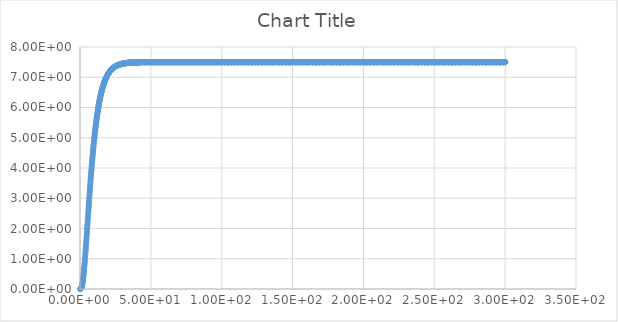
| Category | Series 0 |
|---|---|
| 0.1 | 0 |
| 0.2 | 0.001 |
| 0.3 | 0.002 |
| 0.4 | 0.004 |
| 0.5 | 0.007 |
| 0.6 | 0.011 |
| 0.7 | 0.018 |
| 0.8 | 0.025 |
| 0.9 | 0.035 |
| 1.0 | 0.046 |
| 1.1 | 0.06 |
| 1.2 | 0.076 |
| 1.3 | 0.094 |
| 1.4 | 0.114 |
| 1.5 | 0.136 |
| 1.6 | 0.16 |
| 1.7 | 0.187 |
| 1.8 | 0.215 |
| 1.9 | 0.246 |
| 2.0 | 0.279 |
| 2.1 | 0.314 |
| 2.2 | 0.352 |
| 2.3 | 0.391 |
| 2.4 | 0.432 |
| 2.5 | 0.475 |
| 2.6 | 0.519 |
| 2.7 | 0.566 |
| 2.8 | 0.614 |
| 2.9 | 0.664 |
| 3.0 | 0.715 |
| 3.1 | 0.768 |
| 3.2 | 0.822 |
| 3.3 | 0.877 |
| 3.4 | 0.934 |
| 3.5 | 0.992 |
| 3.6 | 1.05 |
| 3.7 | 1.11 |
| 3.8 | 1.17 |
| 3.9 | 1.23 |
| 4.0 | 1.3 |
| 4.1 | 1.36 |
| 4.2 | 1.42 |
| 4.3 | 1.49 |
| 4.4 | 1.55 |
| 4.5 | 1.62 |
| 4.6 | 1.69 |
| 4.7 | 1.75 |
| 4.8 | 1.82 |
| 4.9 | 1.89 |
| 5.0 | 1.96 |
| 5.1 | 2.02 |
| 5.2 | 2.09 |
| 5.3 | 2.16 |
| 5.4 | 2.23 |
| 5.5 | 2.3 |
| 5.6 | 2.36 |
| 5.7 | 2.43 |
| 5.8 | 2.5 |
| 5.9 | 2.57 |
| 6.0 | 2.64 |
| 6.1 | 2.7 |
| 6.2 | 2.77 |
| 6.3 | 2.84 |
| 6.4 | 2.9 |
| 6.5 | 2.97 |
| 6.6 | 3.04 |
| 6.7 | 3.1 |
| 6.8 | 3.17 |
| 6.9 | 3.23 |
| 7.0 | 3.29 |
| 7.1 | 3.36 |
| 7.2 | 3.42 |
| 7.3 | 3.48 |
| 7.4 | 3.54 |
| 7.5 | 3.61 |
| 7.6 | 3.67 |
| 7.7 | 3.73 |
| 7.8 | 3.79 |
| 7.9 | 3.85 |
| 8.0 | 3.9 |
| 8.1 | 3.96 |
| 8.2 | 4.02 |
| 8.3 | 4.08 |
| 8.4 | 4.13 |
| 8.5 | 4.19 |
| 8.6 | 4.24 |
| 8.7 | 4.3 |
| 8.8 | 4.35 |
| 8.9 | 4.4 |
| 9.0 | 4.45 |
| 9.1 | 4.51 |
| 9.2 | 4.56 |
| 9.3 | 4.61 |
| 9.4 | 4.66 |
| 9.5 | 4.7 |
| 9.6 | 4.75 |
| 9.7 | 4.8 |
| 9.8 | 4.85 |
| 9.9 | 4.89 |
| 10.0 | 4.94 |
| 10.1 | 4.98 |
| 10.2 | 5.03 |
| 10.3 | 5.07 |
| 10.4 | 5.11 |
| 10.5 | 5.16 |
| 10.6 | 5.2 |
| 10.7 | 5.24 |
| 10.8 | 5.28 |
| 10.9 | 5.32 |
| 11.0 | 5.36 |
| 11.1 | 5.4 |
| 11.2 | 5.44 |
| 11.3 | 5.47 |
| 11.4 | 5.51 |
| 11.5 | 5.55 |
| 11.6 | 5.58 |
| 11.7 | 5.62 |
| 11.8 | 5.65 |
| 11.9 | 5.68 |
| 12.0 | 5.72 |
| 12.1 | 5.75 |
| 12.2 | 5.78 |
| 12.3 | 5.81 |
| 12.4 | 5.85 |
| 12.5 | 5.88 |
| 12.6 | 5.91 |
| 12.7 | 5.94 |
| 12.8 | 5.96 |
| 12.9 | 5.99 |
| 13.0 | 6.02 |
| 13.1 | 6.05 |
| 13.2 | 6.08 |
| 13.3 | 6.1 |
| 13.4 | 6.13 |
| 13.5 | 6.16 |
| 13.6 | 6.18 |
| 13.7 | 6.21 |
| 13.8 | 6.23 |
| 13.9 | 6.25 |
| 14.0 | 6.28 |
| 14.1 | 6.3 |
| 14.2 | 6.32 |
| 14.3 | 6.35 |
| 14.4 | 6.37 |
| 14.5 | 6.39 |
| 14.6 | 6.41 |
| 14.7 | 6.43 |
| 14.8 | 6.45 |
| 14.9 | 6.47 |
| 15.0 | 6.49 |
| 15.1 | 6.51 |
| 15.2 | 6.53 |
| 15.3 | 6.55 |
| 15.4 | 6.57 |
| 15.5 | 6.58 |
| 15.6 | 6.6 |
| 15.7 | 6.62 |
| 15.8 | 6.64 |
| 15.9 | 6.65 |
| 16.0 | 6.67 |
| 16.1 | 6.68 |
| 16.2 | 6.7 |
| 16.3 | 6.72 |
| 16.4 | 6.73 |
| 16.5 | 6.75 |
| 16.6 | 6.76 |
| 16.7 | 6.77 |
| 16.8 | 6.79 |
| 16.9 | 6.8 |
| 17.0 | 6.82 |
| 17.1 | 6.83 |
| 17.2 | 6.84 |
| 17.3 | 6.86 |
| 17.4 | 6.87 |
| 17.5 | 6.88 |
| 17.6 | 6.89 |
| 17.7 | 6.9 |
| 17.8 | 6.92 |
| 17.9 | 6.93 |
| 18.0 | 6.94 |
| 18.1 | 6.95 |
| 18.2 | 6.96 |
| 18.3 | 6.97 |
| 18.4 | 6.98 |
| 18.5 | 6.99 |
| 18.6 | 7 |
| 18.7 | 7.01 |
| 18.8 | 7.02 |
| 18.9 | 7.03 |
| 19.0 | 7.04 |
| 19.1 | 7.05 |
| 19.2 | 7.06 |
| 19.3 | 7.07 |
| 19.4 | 7.07 |
| 19.5 | 7.08 |
| 19.6 | 7.09 |
| 19.7 | 7.1 |
| 19.8 | 7.11 |
| 19.9 | 7.11 |
| 20.0 | 7.12 |
| 20.1 | 7.13 |
| 20.2 | 7.14 |
| 20.3 | 7.14 |
| 20.4 | 7.15 |
| 20.5 | 7.16 |
| 20.6 | 7.16 |
| 20.7 | 7.17 |
| 20.8 | 7.18 |
| 20.9 | 7.18 |
| 21.0 | 7.19 |
| 21.1 | 7.2 |
| 21.2 | 7.2 |
| 21.3 | 7.21 |
| 21.4 | 7.21 |
| 21.5 | 7.22 |
| 21.6 | 7.22 |
| 21.7 | 7.23 |
| 21.8 | 7.24 |
| 21.9 | 7.24 |
| 22.0 | 7.25 |
| 22.1 | 7.25 |
| 22.2 | 7.26 |
| 22.3 | 7.26 |
| 22.4 | 7.26 |
| 22.5 | 7.27 |
| 22.6 | 7.27 |
| 22.7 | 7.28 |
| 22.8 | 7.28 |
| 22.9 | 7.29 |
| 23.0 | 7.29 |
| 23.1 | 7.3 |
| 23.2 | 7.3 |
| 23.3 | 7.3 |
| 23.4 | 7.31 |
| 23.5 | 7.31 |
| 23.6 | 7.31 |
| 23.7 | 7.32 |
| 23.8 | 7.32 |
| 23.9 | 7.33 |
| 24.0 | 7.33 |
| 24.1 | 7.33 |
| 24.2 | 7.34 |
| 24.3 | 7.34 |
| 24.4 | 7.34 |
| 24.5 | 7.35 |
| 24.6 | 7.35 |
| 24.7 | 7.35 |
| 24.8 | 7.35 |
| 24.9 | 7.36 |
| 25.0 | 7.36 |
| 25.1 | 7.36 |
| 25.2 | 7.37 |
| 25.3 | 7.37 |
| 25.4 | 7.37 |
| 25.5 | 7.37 |
| 25.6 | 7.38 |
| 25.7 | 7.38 |
| 25.8 | 7.38 |
| 25.9 | 7.38 |
| 26.0 | 7.39 |
| 26.1 | 7.39 |
| 26.2 | 7.39 |
| 26.3 | 7.39 |
| 26.4 | 7.39 |
| 26.5 | 7.4 |
| 26.6 | 7.4 |
| 26.7 | 7.4 |
| 26.8 | 7.4 |
| 26.9 | 7.4 |
| 27.0 | 7.41 |
| 27.1 | 7.41 |
| 27.2 | 7.41 |
| 27.3 | 7.41 |
| 27.4 | 7.41 |
| 27.5 | 7.41 |
| 27.6 | 7.42 |
| 27.7 | 7.42 |
| 27.8 | 7.42 |
| 27.9 | 7.42 |
| 28.0 | 7.42 |
| 28.1 | 7.42 |
| 28.2 | 7.43 |
| 28.3 | 7.43 |
| 28.4 | 7.43 |
| 28.5 | 7.43 |
| 28.6 | 7.43 |
| 28.7 | 7.43 |
| 28.8 | 7.43 |
| 28.9 | 7.44 |
| 29.0 | 7.44 |
| 29.1 | 7.44 |
| 29.2 | 7.44 |
| 29.3 | 7.44 |
| 29.4 | 7.44 |
| 29.5 | 7.44 |
| 29.6 | 7.44 |
| 29.7 | 7.45 |
| 29.8 | 7.45 |
| 29.9 | 7.45 |
| 30.0 | 7.45 |
| 30.1 | 7.45 |
| 30.2 | 7.45 |
| 30.3 | 7.45 |
| 30.4 | 7.45 |
| 30.5 | 7.45 |
| 30.6 | 7.45 |
| 30.7 | 7.46 |
| 30.8 | 7.46 |
| 30.9 | 7.46 |
| 31.0 | 7.46 |
| 31.1 | 7.46 |
| 31.2 | 7.46 |
| 31.3 | 7.46 |
| 31.4 | 7.46 |
| 31.5 | 7.46 |
| 31.6 | 7.46 |
| 31.7 | 7.46 |
| 31.8 | 7.46 |
| 31.9 | 7.46 |
| 32.0 | 7.47 |
| 32.1 | 7.47 |
| 32.2 | 7.47 |
| 32.3 | 7.47 |
| 32.4 | 7.47 |
| 32.5 | 7.47 |
| 32.6 | 7.47 |
| 32.7 | 7.47 |
| 32.8 | 7.47 |
| 32.9 | 7.47 |
| 33.0 | 7.47 |
| 33.1 | 7.47 |
| 33.2 | 7.47 |
| 33.3 | 7.47 |
| 33.4 | 7.47 |
| 33.5 | 7.47 |
| 33.6 | 7.47 |
| 33.7 | 7.48 |
| 33.8 | 7.48 |
| 33.9 | 7.48 |
| 34.0 | 7.48 |
| 34.1 | 7.48 |
| 34.2 | 7.48 |
| 34.3 | 7.48 |
| 34.4 | 7.48 |
| 34.5 | 7.48 |
| 34.6 | 7.48 |
| 34.7 | 7.48 |
| 34.8 | 7.48 |
| 34.9 | 7.48 |
| 35.0 | 7.48 |
| 35.1 | 7.48 |
| 35.2 | 7.48 |
| 35.3 | 7.48 |
| 35.4 | 7.48 |
| 35.5 | 7.48 |
| 35.6 | 7.48 |
| 35.7 | 7.48 |
| 35.8 | 7.48 |
| 35.9 | 7.48 |
| 36.0 | 7.48 |
| 36.1 | 7.48 |
| 36.2 | 7.48 |
| 36.3 | 7.49 |
| 36.4 | 7.49 |
| 36.5 | 7.49 |
| 36.6 | 7.49 |
| 36.7 | 7.49 |
| 36.8 | 7.49 |
| 36.9 | 7.49 |
| 37.0 | 7.49 |
| 37.1 | 7.49 |
| 37.2 | 7.49 |
| 37.3 | 7.49 |
| 37.4 | 7.49 |
| 37.5 | 7.49 |
| 37.6 | 7.49 |
| 37.7 | 7.49 |
| 37.8 | 7.49 |
| 37.9 | 7.49 |
| 38.0 | 7.49 |
| 38.1 | 7.49 |
| 38.2 | 7.49 |
| 38.3 | 7.49 |
| 38.4 | 7.49 |
| 38.5 | 7.49 |
| 38.6 | 7.49 |
| 38.7 | 7.49 |
| 38.8 | 7.49 |
| 38.9 | 7.49 |
| 39.0 | 7.49 |
| 39.1 | 7.49 |
| 39.2 | 7.49 |
| 39.3 | 7.49 |
| 39.4 | 7.49 |
| 39.5 | 7.49 |
| 39.6 | 7.49 |
| 39.7 | 7.49 |
| 39.8 | 7.49 |
| 39.9 | 7.49 |
| 40.0 | 7.49 |
| 40.1 | 7.49 |
| 40.2 | 7.49 |
| 40.3 | 7.49 |
| 40.4 | 7.49 |
| 40.5 | 7.49 |
| 40.6 | 7.49 |
| 40.7 | 7.49 |
| 40.8 | 7.49 |
| 40.9 | 7.49 |
| 41.0 | 7.49 |
| 41.1 | 7.49 |
| 41.2 | 7.49 |
| 41.3 | 7.49 |
| 41.4 | 7.49 |
| 41.5 | 7.49 |
| 41.6 | 7.49 |
| 41.7 | 7.49 |
| 41.8 | 7.5 |
| 41.9 | 7.5 |
| 42.0 | 7.5 |
| 42.1 | 7.5 |
| 42.2 | 7.5 |
| 42.3 | 7.5 |
| 42.4 | 7.5 |
| 42.5 | 7.5 |
| 42.6 | 7.5 |
| 42.7 | 7.5 |
| 42.8 | 7.5 |
| 42.9 | 7.5 |
| 43.0 | 7.5 |
| 43.1 | 7.5 |
| 43.2 | 7.5 |
| 43.3 | 7.5 |
| 43.4 | 7.5 |
| 43.5 | 7.5 |
| 43.6 | 7.5 |
| 43.7 | 7.5 |
| 43.8 | 7.5 |
| 43.9 | 7.5 |
| 44.0 | 7.5 |
| 44.1 | 7.5 |
| 44.2 | 7.5 |
| 44.3 | 7.5 |
| 44.4 | 7.5 |
| 44.5 | 7.5 |
| 44.6 | 7.5 |
| 44.7 | 7.5 |
| 44.8 | 7.5 |
| 44.9 | 7.5 |
| 45.0 | 7.5 |
| 45.1 | 7.5 |
| 45.2 | 7.5 |
| 45.3 | 7.5 |
| 45.4 | 7.5 |
| 45.5 | 7.5 |
| 45.6 | 7.5 |
| 45.7 | 7.5 |
| 45.8 | 7.5 |
| 45.9 | 7.5 |
| 46.0 | 7.5 |
| 46.1 | 7.5 |
| 46.2 | 7.5 |
| 46.3 | 7.5 |
| 46.4 | 7.5 |
| 46.5 | 7.5 |
| 46.6 | 7.5 |
| 46.7 | 7.5 |
| 46.8 | 7.5 |
| 46.9 | 7.5 |
| 47.0 | 7.5 |
| 47.1 | 7.5 |
| 47.2 | 7.5 |
| 47.3 | 7.5 |
| 47.4 | 7.5 |
| 47.5 | 7.5 |
| 47.6 | 7.5 |
| 47.7 | 7.5 |
| 47.8 | 7.5 |
| 47.9 | 7.5 |
| 48.0 | 7.5 |
| 48.1 | 7.5 |
| 48.2 | 7.5 |
| 48.3 | 7.5 |
| 48.4 | 7.5 |
| 48.5 | 7.5 |
| 48.6 | 7.5 |
| 48.7 | 7.5 |
| 48.8 | 7.5 |
| 48.9 | 7.5 |
| 49.0 | 7.5 |
| 49.1 | 7.5 |
| 49.2 | 7.5 |
| 49.3 | 7.5 |
| 49.4 | 7.5 |
| 49.5 | 7.5 |
| 49.6 | 7.5 |
| 49.7 | 7.5 |
| 49.8 | 7.5 |
| 49.9 | 7.5 |
| 50.0 | 7.5 |
| 50.1 | 7.5 |
| 50.2 | 7.5 |
| 50.3 | 7.5 |
| 50.4 | 7.5 |
| 50.5 | 7.5 |
| 50.6 | 7.5 |
| 50.7 | 7.5 |
| 50.8 | 7.5 |
| 50.9 | 7.5 |
| 51.0 | 7.5 |
| 51.1 | 7.5 |
| 51.2 | 7.5 |
| 51.3 | 7.5 |
| 51.4 | 7.5 |
| 51.5 | 7.5 |
| 51.6 | 7.5 |
| 51.7 | 7.5 |
| 51.8 | 7.5 |
| 51.9 | 7.5 |
| 52.0 | 7.5 |
| 52.1 | 7.5 |
| 52.2 | 7.5 |
| 52.3 | 7.5 |
| 52.4 | 7.5 |
| 52.5 | 7.5 |
| 52.6 | 7.5 |
| 52.7 | 7.5 |
| 52.8 | 7.5 |
| 52.9 | 7.5 |
| 53.0 | 7.5 |
| 53.1 | 7.5 |
| 53.2 | 7.5 |
| 53.3 | 7.5 |
| 53.4 | 7.5 |
| 53.5 | 7.5 |
| 53.6 | 7.5 |
| 53.7 | 7.5 |
| 53.8 | 7.5 |
| 53.9 | 7.5 |
| 54.0 | 7.5 |
| 54.1 | 7.5 |
| 54.2 | 7.5 |
| 54.3 | 7.5 |
| 54.4 | 7.5 |
| 54.5 | 7.5 |
| 54.6 | 7.5 |
| 54.7 | 7.5 |
| 54.8 | 7.5 |
| 54.9 | 7.5 |
| 55.0 | 7.5 |
| 55.1 | 7.5 |
| 55.2 | 7.5 |
| 55.3 | 7.5 |
| 55.4 | 7.5 |
| 55.5 | 7.5 |
| 55.6 | 7.5 |
| 55.7 | 7.5 |
| 55.8 | 7.5 |
| 55.9 | 7.5 |
| 56.0 | 7.5 |
| 56.1 | 7.5 |
| 56.2 | 7.5 |
| 56.3 | 7.5 |
| 56.4 | 7.5 |
| 56.5 | 7.5 |
| 56.6 | 7.5 |
| 56.7 | 7.5 |
| 56.8 | 7.5 |
| 56.9 | 7.5 |
| 57.0 | 7.5 |
| 57.1 | 7.5 |
| 57.2 | 7.5 |
| 57.3 | 7.5 |
| 57.4 | 7.5 |
| 57.5 | 7.5 |
| 57.6 | 7.5 |
| 57.7 | 7.5 |
| 57.8 | 7.5 |
| 57.9 | 7.5 |
| 58.0 | 7.5 |
| 58.1 | 7.5 |
| 58.2 | 7.5 |
| 58.3 | 7.5 |
| 58.4 | 7.5 |
| 58.5 | 7.5 |
| 58.6 | 7.5 |
| 58.7 | 7.5 |
| 58.8 | 7.5 |
| 58.9 | 7.5 |
| 59.0 | 7.5 |
| 59.1 | 7.5 |
| 59.2 | 7.5 |
| 59.3 | 7.5 |
| 59.4 | 7.5 |
| 59.5 | 7.5 |
| 59.6 | 7.5 |
| 59.7 | 7.5 |
| 59.8 | 7.5 |
| 59.9 | 7.5 |
| 60.0 | 7.5 |
| 60.1 | 7.5 |
| 60.2 | 7.5 |
| 60.3 | 7.5 |
| 60.4 | 7.5 |
| 60.5 | 7.5 |
| 60.6 | 7.5 |
| 60.7 | 7.5 |
| 60.8 | 7.5 |
| 60.9 | 7.5 |
| 61.0 | 7.5 |
| 61.1 | 7.5 |
| 61.2 | 7.5 |
| 61.3 | 7.5 |
| 61.4 | 7.5 |
| 61.5 | 7.5 |
| 61.6 | 7.5 |
| 61.7 | 7.5 |
| 61.8 | 7.5 |
| 61.9 | 7.5 |
| 62.0 | 7.5 |
| 62.1 | 7.5 |
| 62.2 | 7.5 |
| 62.3 | 7.5 |
| 62.4 | 7.5 |
| 62.5 | 7.5 |
| 62.6 | 7.5 |
| 62.7 | 7.5 |
| 62.8 | 7.5 |
| 62.9 | 7.5 |
| 63.0 | 7.5 |
| 63.1 | 7.5 |
| 63.2 | 7.5 |
| 63.3 | 7.5 |
| 63.4 | 7.5 |
| 63.5 | 7.5 |
| 63.6 | 7.5 |
| 63.7 | 7.5 |
| 63.8 | 7.5 |
| 63.9 | 7.5 |
| 64.0 | 7.5 |
| 64.1 | 7.5 |
| 64.2 | 7.5 |
| 64.3 | 7.5 |
| 64.4 | 7.5 |
| 64.5 | 7.5 |
| 64.6 | 7.5 |
| 64.7 | 7.5 |
| 64.8 | 7.5 |
| 64.9 | 7.5 |
| 65.0 | 7.5 |
| 65.1 | 7.5 |
| 65.2 | 7.5 |
| 65.3 | 7.5 |
| 65.4 | 7.5 |
| 65.5 | 7.5 |
| 65.6 | 7.5 |
| 65.7 | 7.5 |
| 65.8 | 7.5 |
| 65.9 | 7.5 |
| 66.0 | 7.5 |
| 66.1 | 7.5 |
| 66.2 | 7.5 |
| 66.3 | 7.5 |
| 66.4 | 7.5 |
| 66.5 | 7.5 |
| 66.6 | 7.5 |
| 66.7 | 7.5 |
| 66.8 | 7.5 |
| 66.9 | 7.5 |
| 67.0 | 7.5 |
| 67.1 | 7.5 |
| 67.2 | 7.5 |
| 67.3 | 7.5 |
| 67.4 | 7.5 |
| 67.5 | 7.5 |
| 67.6 | 7.5 |
| 67.7 | 7.5 |
| 67.8 | 7.5 |
| 67.9 | 7.5 |
| 68.0 | 7.5 |
| 68.1 | 7.5 |
| 68.2 | 7.5 |
| 68.3 | 7.5 |
| 68.4 | 7.5 |
| 68.5 | 7.5 |
| 68.6 | 7.5 |
| 68.7 | 7.5 |
| 68.8 | 7.5 |
| 68.9 | 7.5 |
| 69.0 | 7.5 |
| 69.1 | 7.5 |
| 69.2 | 7.5 |
| 69.3 | 7.5 |
| 69.4 | 7.5 |
| 69.5 | 7.5 |
| 69.6 | 7.5 |
| 69.7 | 7.5 |
| 69.8 | 7.5 |
| 69.9 | 7.5 |
| 70.0 | 7.5 |
| 70.1 | 7.5 |
| 70.2 | 7.5 |
| 70.3 | 7.5 |
| 70.4 | 7.5 |
| 70.5 | 7.5 |
| 70.6 | 7.5 |
| 70.7 | 7.5 |
| 70.8 | 7.5 |
| 70.9 | 7.5 |
| 71.0 | 7.5 |
| 71.1 | 7.5 |
| 71.2 | 7.5 |
| 71.3 | 7.5 |
| 71.4 | 7.5 |
| 71.5 | 7.5 |
| 71.6 | 7.5 |
| 71.7 | 7.5 |
| 71.8 | 7.5 |
| 71.9 | 7.5 |
| 72.0 | 7.5 |
| 72.1 | 7.5 |
| 72.2 | 7.5 |
| 72.3 | 7.5 |
| 72.4 | 7.5 |
| 72.5 | 7.5 |
| 72.6 | 7.5 |
| 72.7 | 7.5 |
| 72.8 | 7.5 |
| 72.9 | 7.5 |
| 73.0 | 7.5 |
| 73.1 | 7.5 |
| 73.2 | 7.5 |
| 73.3 | 7.5 |
| 73.4 | 7.5 |
| 73.5 | 7.5 |
| 73.6 | 7.5 |
| 73.7 | 7.5 |
| 73.8 | 7.5 |
| 73.9 | 7.5 |
| 74.0 | 7.5 |
| 74.1 | 7.5 |
| 74.2 | 7.5 |
| 74.3 | 7.5 |
| 74.4 | 7.5 |
| 74.5 | 7.5 |
| 74.6 | 7.5 |
| 74.7 | 7.5 |
| 74.8 | 7.5 |
| 74.9 | 7.5 |
| 75.0 | 7.5 |
| 75.1 | 7.5 |
| 75.2 | 7.5 |
| 75.3 | 7.5 |
| 75.4 | 7.5 |
| 75.5 | 7.5 |
| 75.6 | 7.5 |
| 75.7 | 7.5 |
| 75.8 | 7.5 |
| 75.9 | 7.5 |
| 76.0 | 7.5 |
| 76.1 | 7.5 |
| 76.2 | 7.5 |
| 76.3 | 7.5 |
| 76.4 | 7.5 |
| 76.5 | 7.5 |
| 76.6 | 7.5 |
| 76.7 | 7.5 |
| 76.8 | 7.5 |
| 76.9 | 7.5 |
| 77.0 | 7.5 |
| 77.1 | 7.5 |
| 77.2 | 7.5 |
| 77.3 | 7.5 |
| 77.4 | 7.5 |
| 77.5 | 7.5 |
| 77.6 | 7.5 |
| 77.7 | 7.5 |
| 77.8 | 7.5 |
| 77.9 | 7.5 |
| 78.0 | 7.5 |
| 78.1 | 7.5 |
| 78.2 | 7.5 |
| 78.3 | 7.5 |
| 78.4 | 7.5 |
| 78.5 | 7.5 |
| 78.6 | 7.5 |
| 78.7 | 7.5 |
| 78.8 | 7.5 |
| 78.9 | 7.5 |
| 79.0 | 7.5 |
| 79.1 | 7.5 |
| 79.2 | 7.5 |
| 79.3 | 7.5 |
| 79.4 | 7.5 |
| 79.5 | 7.5 |
| 79.6 | 7.5 |
| 79.7 | 7.5 |
| 79.8 | 7.5 |
| 79.9 | 7.5 |
| 80.0 | 7.5 |
| 80.1 | 7.5 |
| 80.2 | 7.5 |
| 80.3 | 7.5 |
| 80.4 | 7.5 |
| 80.5 | 7.5 |
| 80.6 | 7.5 |
| 80.7 | 7.5 |
| 80.8 | 7.5 |
| 80.9 | 7.5 |
| 81.0 | 7.5 |
| 81.1 | 7.5 |
| 81.2 | 7.5 |
| 81.3 | 7.5 |
| 81.4 | 7.5 |
| 81.5 | 7.5 |
| 81.6 | 7.5 |
| 81.7 | 7.5 |
| 81.8 | 7.5 |
| 81.9 | 7.5 |
| 82.0 | 7.5 |
| 82.1 | 7.5 |
| 82.2 | 7.5 |
| 82.3 | 7.5 |
| 82.4 | 7.5 |
| 82.5 | 7.5 |
| 82.6 | 7.5 |
| 82.7 | 7.5 |
| 82.8 | 7.5 |
| 82.9 | 7.5 |
| 83.0 | 7.5 |
| 83.1 | 7.5 |
| 83.2 | 7.5 |
| 83.3 | 7.5 |
| 83.4 | 7.5 |
| 83.5 | 7.5 |
| 83.6 | 7.5 |
| 83.7 | 7.5 |
| 83.8 | 7.5 |
| 83.9 | 7.5 |
| 84.0 | 7.5 |
| 84.1 | 7.5 |
| 84.2 | 7.5 |
| 84.3 | 7.5 |
| 84.4 | 7.5 |
| 84.5 | 7.5 |
| 84.6 | 7.5 |
| 84.7 | 7.5 |
| 84.8 | 7.5 |
| 84.9 | 7.5 |
| 85.0 | 7.5 |
| 85.1 | 7.5 |
| 85.2 | 7.5 |
| 85.3 | 7.5 |
| 85.4 | 7.5 |
| 85.5 | 7.5 |
| 85.6 | 7.5 |
| 85.7 | 7.5 |
| 85.8 | 7.5 |
| 85.9 | 7.5 |
| 86.0 | 7.5 |
| 86.1 | 7.5 |
| 86.2 | 7.5 |
| 86.3 | 7.5 |
| 86.4 | 7.5 |
| 86.5 | 7.5 |
| 86.6 | 7.5 |
| 86.7 | 7.5 |
| 86.8 | 7.5 |
| 86.9 | 7.5 |
| 87.0 | 7.5 |
| 87.1 | 7.5 |
| 87.2 | 7.5 |
| 87.3 | 7.5 |
| 87.4 | 7.5 |
| 87.5 | 7.5 |
| 87.6 | 7.5 |
| 87.7 | 7.5 |
| 87.8 | 7.5 |
| 87.9 | 7.5 |
| 88.0 | 7.5 |
| 88.1 | 7.5 |
| 88.2 | 7.5 |
| 88.3 | 7.5 |
| 88.4 | 7.5 |
| 88.5 | 7.5 |
| 88.6 | 7.5 |
| 88.7 | 7.5 |
| 88.8 | 7.5 |
| 88.9 | 7.5 |
| 89.0 | 7.5 |
| 89.1 | 7.5 |
| 89.2 | 7.5 |
| 89.3 | 7.5 |
| 89.4 | 7.5 |
| 89.5 | 7.5 |
| 89.6 | 7.5 |
| 89.7 | 7.5 |
| 89.8 | 7.5 |
| 89.9 | 7.5 |
| 90.0 | 7.5 |
| 90.1 | 7.5 |
| 90.2 | 7.5 |
| 90.3 | 7.5 |
| 90.4 | 7.5 |
| 90.5 | 7.5 |
| 90.6 | 7.5 |
| 90.7 | 7.5 |
| 90.8 | 7.5 |
| 90.9 | 7.5 |
| 91.0 | 7.5 |
| 91.1 | 7.5 |
| 91.2 | 7.5 |
| 91.3 | 7.5 |
| 91.4 | 7.5 |
| 91.5 | 7.5 |
| 91.6 | 7.5 |
| 91.7 | 7.5 |
| 91.8 | 7.5 |
| 91.9 | 7.5 |
| 92.0 | 7.5 |
| 92.1 | 7.5 |
| 92.2 | 7.5 |
| 92.3 | 7.5 |
| 92.4 | 7.5 |
| 92.5 | 7.5 |
| 92.6 | 7.5 |
| 92.7 | 7.5 |
| 92.8 | 7.5 |
| 92.9 | 7.5 |
| 93.0 | 7.5 |
| 93.1 | 7.5 |
| 93.2 | 7.5 |
| 93.3 | 7.5 |
| 93.4 | 7.5 |
| 93.5 | 7.5 |
| 93.6 | 7.5 |
| 93.7 | 7.5 |
| 93.8 | 7.5 |
| 93.9 | 7.5 |
| 94.0 | 7.5 |
| 94.1 | 7.5 |
| 94.2 | 7.5 |
| 94.3 | 7.5 |
| 94.4 | 7.5 |
| 94.5 | 7.5 |
| 94.6 | 7.5 |
| 94.7 | 7.5 |
| 94.8 | 7.5 |
| 94.9 | 7.5 |
| 95.0 | 7.5 |
| 95.1 | 7.5 |
| 95.2 | 7.5 |
| 95.3 | 7.5 |
| 95.4 | 7.5 |
| 95.5 | 7.5 |
| 95.6 | 7.5 |
| 95.7 | 7.5 |
| 95.8 | 7.5 |
| 95.9 | 7.5 |
| 96.0 | 7.5 |
| 96.1 | 7.5 |
| 96.2 | 7.5 |
| 96.3 | 7.5 |
| 96.4 | 7.5 |
| 96.5 | 7.5 |
| 96.6 | 7.5 |
| 96.7 | 7.5 |
| 96.8 | 7.5 |
| 96.9 | 7.5 |
| 97.0 | 7.5 |
| 97.1 | 7.5 |
| 97.2 | 7.5 |
| 97.3 | 7.5 |
| 97.4 | 7.5 |
| 97.5 | 7.5 |
| 97.6 | 7.5 |
| 97.7 | 7.5 |
| 97.8 | 7.5 |
| 97.9 | 7.5 |
| 98.0 | 7.5 |
| 98.1 | 7.5 |
| 98.2 | 7.5 |
| 98.3 | 7.5 |
| 98.4 | 7.5 |
| 98.5 | 7.5 |
| 98.6 | 7.5 |
| 98.7 | 7.5 |
| 98.8 | 7.5 |
| 98.9 | 7.5 |
| 99.0 | 7.5 |
| 99.1 | 7.5 |
| 99.2 | 7.5 |
| 99.3 | 7.5 |
| 99.4 | 7.5 |
| 99.5 | 7.5 |
| 99.6 | 7.5 |
| 99.7 | 7.5 |
| 99.8 | 7.5 |
| 99.9 | 7.5 |
| 100.0 | 7.5 |
| 100.0 | 7.5 |
| 100.0 | 7.5 |
| 100.0 | 7.5 |
| 100.0 | 7.5 |
| 100.0 | 7.5 |
| 101.0 | 7.5 |
| 101.0 | 7.5 |
| 101.0 | 7.5 |
| 101.0 | 7.5 |
| 101.0 | 7.5 |
| 101.0 | 7.5 |
| 101.0 | 7.5 |
| 101.0 | 7.5 |
| 101.0 | 7.5 |
| 102.0 | 7.5 |
| 102.0 | 7.5 |
| 102.0 | 7.5 |
| 102.0 | 7.5 |
| 102.0 | 7.5 |
| 102.0 | 7.5 |
| 102.0 | 7.5 |
| 102.0 | 7.5 |
| 102.0 | 7.5 |
| 102.0 | 7.5 |
| 102.0 | 7.5 |
| 103.0 | 7.5 |
| 103.0 | 7.5 |
| 103.0 | 7.5 |
| 103.0 | 7.5 |
| 103.0 | 7.5 |
| 103.0 | 7.5 |
| 103.0 | 7.5 |
| 103.0 | 7.5 |
| 103.0 | 7.5 |
| 104.0 | 7.5 |
| 104.0 | 7.5 |
| 104.0 | 7.5 |
| 104.0 | 7.5 |
| 104.0 | 7.5 |
| 104.0 | 7.5 |
| 104.0 | 7.5 |
| 104.0 | 7.5 |
| 104.0 | 7.5 |
| 104.0 | 7.5 |
| 104.0 | 7.5 |
| 105.0 | 7.5 |
| 105.0 | 7.5 |
| 105.0 | 7.5 |
| 105.0 | 7.5 |
| 105.0 | 7.5 |
| 105.0 | 7.5 |
| 105.0 | 7.5 |
| 105.0 | 7.5 |
| 105.0 | 7.5 |
| 106.0 | 7.5 |
| 106.0 | 7.5 |
| 106.0 | 7.5 |
| 106.0 | 7.5 |
| 106.0 | 7.5 |
| 106.0 | 7.5 |
| 106.0 | 7.5 |
| 106.0 | 7.5 |
| 106.0 | 7.5 |
| 106.0 | 7.5 |
| 106.0 | 7.5 |
| 107.0 | 7.5 |
| 107.0 | 7.5 |
| 107.0 | 7.5 |
| 107.0 | 7.5 |
| 107.0 | 7.5 |
| 107.0 | 7.5 |
| 107.0 | 7.5 |
| 107.0 | 7.5 |
| 107.0 | 7.5 |
| 108.0 | 7.5 |
| 108.0 | 7.5 |
| 108.0 | 7.5 |
| 108.0 | 7.5 |
| 108.0 | 7.5 |
| 108.0 | 7.5 |
| 108.0 | 7.5 |
| 108.0 | 7.5 |
| 108.0 | 7.5 |
| 108.0 | 7.5 |
| 108.0 | 7.5 |
| 109.0 | 7.5 |
| 109.0 | 7.5 |
| 109.0 | 7.5 |
| 109.0 | 7.5 |
| 109.0 | 7.5 |
| 109.0 | 7.5 |
| 109.0 | 7.5 |
| 109.0 | 7.5 |
| 109.0 | 7.5 |
| 110.0 | 7.5 |
| 110.0 | 7.5 |
| 110.0 | 7.5 |
| 110.0 | 7.5 |
| 110.0 | 7.5 |
| 110.0 | 7.5 |
| 110.0 | 7.5 |
| 110.0 | 7.5 |
| 110.0 | 7.5 |
| 110.0 | 7.5 |
| 110.0 | 7.5 |
| 111.0 | 7.5 |
| 111.0 | 7.5 |
| 111.0 | 7.5 |
| 111.0 | 7.5 |
| 111.0 | 7.5 |
| 111.0 | 7.5 |
| 111.0 | 7.5 |
| 111.0 | 7.5 |
| 111.0 | 7.5 |
| 112.0 | 7.5 |
| 112.0 | 7.5 |
| 112.0 | 7.5 |
| 112.0 | 7.5 |
| 112.0 | 7.5 |
| 112.0 | 7.5 |
| 112.0 | 7.5 |
| 112.0 | 7.5 |
| 112.0 | 7.5 |
| 112.0 | 7.5 |
| 112.0 | 7.5 |
| 113.0 | 7.5 |
| 113.0 | 7.5 |
| 113.0 | 7.5 |
| 113.0 | 7.5 |
| 113.0 | 7.5 |
| 113.0 | 7.5 |
| 113.0 | 7.5 |
| 113.0 | 7.5 |
| 113.0 | 7.5 |
| 114.0 | 7.5 |
| 114.0 | 7.5 |
| 114.0 | 7.5 |
| 114.0 | 7.5 |
| 114.0 | 7.5 |
| 114.0 | 7.5 |
| 114.0 | 7.5 |
| 114.0 | 7.5 |
| 114.0 | 7.5 |
| 114.0 | 7.5 |
| 114.0 | 7.5 |
| 115.0 | 7.5 |
| 115.0 | 7.5 |
| 115.0 | 7.5 |
| 115.0 | 7.5 |
| 115.0 | 7.5 |
| 115.0 | 7.5 |
| 115.0 | 7.5 |
| 115.0 | 7.5 |
| 115.0 | 7.5 |
| 116.0 | 7.5 |
| 116.0 | 7.5 |
| 116.0 | 7.5 |
| 116.0 | 7.5 |
| 116.0 | 7.5 |
| 116.0 | 7.5 |
| 116.0 | 7.5 |
| 116.0 | 7.5 |
| 116.0 | 7.5 |
| 116.0 | 7.5 |
| 116.0 | 7.5 |
| 117.0 | 7.5 |
| 117.0 | 7.5 |
| 117.0 | 7.5 |
| 117.0 | 7.5 |
| 117.0 | 7.5 |
| 117.0 | 7.5 |
| 117.0 | 7.5 |
| 117.0 | 7.5 |
| 117.0 | 7.5 |
| 118.0 | 7.5 |
| 118.0 | 7.5 |
| 118.0 | 7.5 |
| 118.0 | 7.5 |
| 118.0 | 7.5 |
| 118.0 | 7.5 |
| 118.0 | 7.5 |
| 118.0 | 7.5 |
| 118.0 | 7.5 |
| 118.0 | 7.5 |
| 118.0 | 7.5 |
| 119.0 | 7.5 |
| 119.0 | 7.5 |
| 119.0 | 7.5 |
| 119.0 | 7.5 |
| 119.0 | 7.5 |
| 119.0 | 7.5 |
| 119.0 | 7.5 |
| 119.0 | 7.5 |
| 119.0 | 7.5 |
| 120.0 | 7.5 |
| 120.0 | 7.5 |
| 120.0 | 7.5 |
| 120.0 | 7.5 |
| 120.0 | 7.5 |
| 120.0 | 7.5 |
| 120.0 | 7.5 |
| 120.0 | 7.5 |
| 120.0 | 7.5 |
| 120.0 | 7.5 |
| 120.0 | 7.5 |
| 121.0 | 7.5 |
| 121.0 | 7.5 |
| 121.0 | 7.5 |
| 121.0 | 7.5 |
| 121.0 | 7.5 |
| 121.0 | 7.5 |
| 121.0 | 7.5 |
| 121.0 | 7.5 |
| 121.0 | 7.5 |
| 122.0 | 7.5 |
| 122.0 | 7.5 |
| 122.0 | 7.5 |
| 122.0 | 7.5 |
| 122.0 | 7.5 |
| 122.0 | 7.5 |
| 122.0 | 7.5 |
| 122.0 | 7.5 |
| 122.0 | 7.5 |
| 122.0 | 7.5 |
| 122.0 | 7.5 |
| 123.0 | 7.5 |
| 123.0 | 7.5 |
| 123.0 | 7.5 |
| 123.0 | 7.5 |
| 123.0 | 7.5 |
| 123.0 | 7.5 |
| 123.0 | 7.5 |
| 123.0 | 7.5 |
| 123.0 | 7.5 |
| 124.0 | 7.5 |
| 124.0 | 7.5 |
| 124.0 | 7.5 |
| 124.0 | 7.5 |
| 124.0 | 7.5 |
| 124.0 | 7.5 |
| 124.0 | 7.5 |
| 124.0 | 7.5 |
| 124.0 | 7.5 |
| 124.0 | 7.5 |
| 124.0 | 7.5 |
| 125.0 | 7.5 |
| 125.0 | 7.5 |
| 125.0 | 7.5 |
| 125.0 | 7.5 |
| 125.0 | 7.5 |
| 125.0 | 7.5 |
| 125.0 | 7.5 |
| 125.0 | 7.5 |
| 125.0 | 7.5 |
| 126.0 | 7.5 |
| 126.0 | 7.5 |
| 126.0 | 7.5 |
| 126.0 | 7.5 |
| 126.0 | 7.5 |
| 126.0 | 7.5 |
| 126.0 | 7.5 |
| 126.0 | 7.5 |
| 126.0 | 7.5 |
| 126.0 | 7.5 |
| 126.0 | 7.5 |
| 127.0 | 7.5 |
| 127.0 | 7.5 |
| 127.0 | 7.5 |
| 127.0 | 7.5 |
| 127.0 | 7.5 |
| 127.0 | 7.5 |
| 127.0 | 7.5 |
| 127.0 | 7.5 |
| 127.0 | 7.5 |
| 128.0 | 7.5 |
| 128.0 | 7.5 |
| 128.0 | 7.5 |
| 128.0 | 7.5 |
| 128.0 | 7.5 |
| 128.0 | 7.5 |
| 128.0 | 7.5 |
| 128.0 | 7.5 |
| 128.0 | 7.5 |
| 128.0 | 7.5 |
| 128.0 | 7.5 |
| 129.0 | 7.5 |
| 129.0 | 7.5 |
| 129.0 | 7.5 |
| 129.0 | 7.5 |
| 129.0 | 7.5 |
| 129.0 | 7.5 |
| 129.0 | 7.5 |
| 129.0 | 7.5 |
| 129.0 | 7.5 |
| 130.0 | 7.5 |
| 130.0 | 7.5 |
| 130.0 | 7.5 |
| 130.0 | 7.5 |
| 130.0 | 7.5 |
| 130.0 | 7.5 |
| 130.0 | 7.5 |
| 130.0 | 7.5 |
| 130.0 | 7.5 |
| 130.0 | 7.5 |
| 130.0 | 7.5 |
| 131.0 | 7.5 |
| 131.0 | 7.5 |
| 131.0 | 7.5 |
| 131.0 | 7.5 |
| 131.0 | 7.5 |
| 131.0 | 7.5 |
| 131.0 | 7.5 |
| 131.0 | 7.5 |
| 131.0 | 7.5 |
| 132.0 | 7.5 |
| 132.0 | 7.5 |
| 132.0 | 7.5 |
| 132.0 | 7.5 |
| 132.0 | 7.5 |
| 132.0 | 7.5 |
| 132.0 | 7.5 |
| 132.0 | 7.5 |
| 132.0 | 7.5 |
| 132.0 | 7.5 |
| 132.0 | 7.5 |
| 133.0 | 7.5 |
| 133.0 | 7.5 |
| 133.0 | 7.5 |
| 133.0 | 7.5 |
| 133.0 | 7.5 |
| 133.0 | 7.5 |
| 133.0 | 7.5 |
| 133.0 | 7.5 |
| 133.0 | 7.5 |
| 134.0 | 7.5 |
| 134.0 | 7.5 |
| 134.0 | 7.5 |
| 134.0 | 7.5 |
| 134.0 | 7.5 |
| 134.0 | 7.5 |
| 134.0 | 7.5 |
| 134.0 | 7.5 |
| 134.0 | 7.5 |
| 134.0 | 7.5 |
| 134.0 | 7.5 |
| 135.0 | 7.5 |
| 135.0 | 7.5 |
| 135.0 | 7.5 |
| 135.0 | 7.5 |
| 135.0 | 7.5 |
| 135.0 | 7.5 |
| 135.0 | 7.5 |
| 135.0 | 7.5 |
| 135.0 | 7.5 |
| 136.0 | 7.5 |
| 136.0 | 7.5 |
| 136.0 | 7.5 |
| 136.0 | 7.5 |
| 136.0 | 7.5 |
| 136.0 | 7.5 |
| 136.0 | 7.5 |
| 136.0 | 7.5 |
| 136.0 | 7.5 |
| 136.0 | 7.5 |
| 136.0 | 7.5 |
| 137.0 | 7.5 |
| 137.0 | 7.5 |
| 137.0 | 7.5 |
| 137.0 | 7.5 |
| 137.0 | 7.5 |
| 137.0 | 7.5 |
| 137.0 | 7.5 |
| 137.0 | 7.5 |
| 137.0 | 7.5 |
| 138.0 | 7.5 |
| 138.0 | 7.5 |
| 138.0 | 7.5 |
| 138.0 | 7.5 |
| 138.0 | 7.5 |
| 138.0 | 7.5 |
| 138.0 | 7.5 |
| 138.0 | 7.5 |
| 138.0 | 7.5 |
| 138.0 | 7.5 |
| 138.0 | 7.5 |
| 139.0 | 7.5 |
| 139.0 | 7.5 |
| 139.0 | 7.5 |
| 139.0 | 7.5 |
| 139.0 | 7.5 |
| 139.0 | 7.5 |
| 139.0 | 7.5 |
| 139.0 | 7.5 |
| 139.0 | 7.5 |
| 140.0 | 7.5 |
| 140.0 | 7.5 |
| 140.0 | 7.5 |
| 140.0 | 7.5 |
| 140.0 | 7.5 |
| 140.0 | 7.5 |
| 140.0 | 7.5 |
| 140.0 | 7.5 |
| 140.0 | 7.5 |
| 140.0 | 7.5 |
| 140.0 | 7.5 |
| 141.0 | 7.5 |
| 141.0 | 7.5 |
| 141.0 | 7.5 |
| 141.0 | 7.5 |
| 141.0 | 7.5 |
| 141.0 | 7.5 |
| 141.0 | 7.5 |
| 141.0 | 7.5 |
| 141.0 | 7.5 |
| 142.0 | 7.5 |
| 142.0 | 7.5 |
| 142.0 | 7.5 |
| 142.0 | 7.5 |
| 142.0 | 7.5 |
| 142.0 | 7.5 |
| 142.0 | 7.5 |
| 142.0 | 7.5 |
| 142.0 | 7.5 |
| 142.0 | 7.5 |
| 142.0 | 7.5 |
| 143.0 | 7.5 |
| 143.0 | 7.5 |
| 143.0 | 7.5 |
| 143.0 | 7.5 |
| 143.0 | 7.5 |
| 143.0 | 7.5 |
| 143.0 | 7.5 |
| 143.0 | 7.5 |
| 143.0 | 7.5 |
| 144.0 | 7.5 |
| 144.0 | 7.5 |
| 144.0 | 7.5 |
| 144.0 | 7.5 |
| 144.0 | 7.5 |
| 144.0 | 7.5 |
| 144.0 | 7.5 |
| 144.0 | 7.5 |
| 144.0 | 7.5 |
| 144.0 | 7.5 |
| 144.0 | 7.5 |
| 145.0 | 7.5 |
| 145.0 | 7.5 |
| 145.0 | 7.5 |
| 145.0 | 7.5 |
| 145.0 | 7.5 |
| 145.0 | 7.5 |
| 145.0 | 7.5 |
| 145.0 | 7.5 |
| 145.0 | 7.5 |
| 146.0 | 7.5 |
| 146.0 | 7.5 |
| 146.0 | 7.5 |
| 146.0 | 7.5 |
| 146.0 | 7.5 |
| 146.0 | 7.5 |
| 146.0 | 7.5 |
| 146.0 | 7.5 |
| 146.0 | 7.5 |
| 146.0 | 7.5 |
| 146.0 | 7.5 |
| 147.0 | 7.5 |
| 147.0 | 7.5 |
| 147.0 | 7.5 |
| 147.0 | 7.5 |
| 147.0 | 7.5 |
| 147.0 | 7.5 |
| 147.0 | 7.5 |
| 147.0 | 7.5 |
| 147.0 | 7.5 |
| 148.0 | 7.5 |
| 148.0 | 7.5 |
| 148.0 | 7.5 |
| 148.0 | 7.5 |
| 148.0 | 7.5 |
| 148.0 | 7.5 |
| 148.0 | 7.5 |
| 148.0 | 7.5 |
| 148.0 | 7.5 |
| 148.0 | 7.5 |
| 148.0 | 7.5 |
| 149.0 | 7.5 |
| 149.0 | 7.5 |
| 149.0 | 7.5 |
| 149.0 | 7.5 |
| 149.0 | 7.5 |
| 149.0 | 7.5 |
| 149.0 | 7.5 |
| 149.0 | 7.5 |
| 149.0 | 7.5 |
| 150.0 | 7.5 |
| 150.0 | 7.5 |
| 150.0 | 7.5 |
| 150.0 | 7.5 |
| 150.0 | 7.5 |
| 150.0 | 7.5 |
| 150.0 | 7.5 |
| 150.0 | 7.5 |
| 150.0 | 7.5 |
| 150.0 | 7.5 |
| 150.0 | 7.5 |
| 151.0 | 7.5 |
| 151.0 | 7.5 |
| 151.0 | 7.5 |
| 151.0 | 7.5 |
| 151.0 | 7.5 |
| 151.0 | 7.5 |
| 151.0 | 7.5 |
| 151.0 | 7.5 |
| 151.0 | 7.5 |
| 152.0 | 7.5 |
| 152.0 | 7.5 |
| 152.0 | 7.5 |
| 152.0 | 7.5 |
| 152.0 | 7.5 |
| 152.0 | 7.5 |
| 152.0 | 7.5 |
| 152.0 | 7.5 |
| 152.0 | 7.5 |
| 152.0 | 7.5 |
| 152.0 | 7.5 |
| 153.0 | 7.5 |
| 153.0 | 7.5 |
| 153.0 | 7.5 |
| 153.0 | 7.5 |
| 153.0 | 7.5 |
| 153.0 | 7.5 |
| 153.0 | 7.5 |
| 153.0 | 7.5 |
| 153.0 | 7.5 |
| 154.0 | 7.5 |
| 154.0 | 7.5 |
| 154.0 | 7.5 |
| 154.0 | 7.5 |
| 154.0 | 7.5 |
| 154.0 | 7.5 |
| 154.0 | 7.5 |
| 154.0 | 7.5 |
| 154.0 | 7.5 |
| 154.0 | 7.5 |
| 154.0 | 7.5 |
| 155.0 | 7.5 |
| 155.0 | 7.5 |
| 155.0 | 7.5 |
| 155.0 | 7.5 |
| 155.0 | 7.5 |
| 155.0 | 7.5 |
| 155.0 | 7.5 |
| 155.0 | 7.5 |
| 155.0 | 7.5 |
| 156.0 | 7.5 |
| 156.0 | 7.5 |
| 156.0 | 7.5 |
| 156.0 | 7.5 |
| 156.0 | 7.5 |
| 156.0 | 7.5 |
| 156.0 | 7.5 |
| 156.0 | 7.5 |
| 156.0 | 7.5 |
| 156.0 | 7.5 |
| 156.0 | 7.5 |
| 157.0 | 7.5 |
| 157.0 | 7.5 |
| 157.0 | 7.5 |
| 157.0 | 7.5 |
| 157.0 | 7.5 |
| 157.0 | 7.5 |
| 157.0 | 7.5 |
| 157.0 | 7.5 |
| 157.0 | 7.5 |
| 158.0 | 7.5 |
| 158.0 | 7.5 |
| 158.0 | 7.5 |
| 158.0 | 7.5 |
| 158.0 | 7.5 |
| 158.0 | 7.5 |
| 158.0 | 7.5 |
| 158.0 | 7.5 |
| 158.0 | 7.5 |
| 158.0 | 7.5 |
| 158.0 | 7.5 |
| 159.0 | 7.5 |
| 159.0 | 7.5 |
| 159.0 | 7.5 |
| 159.0 | 7.5 |
| 159.0 | 7.5 |
| 159.0 | 7.5 |
| 159.0 | 7.5 |
| 159.0 | 7.5 |
| 159.0 | 7.5 |
| 160.0 | 7.5 |
| 160.0 | 7.5 |
| 160.0 | 7.5 |
| 160.0 | 7.5 |
| 160.0 | 7.5 |
| 160.0 | 7.5 |
| 160.0 | 7.5 |
| 160.0 | 7.5 |
| 160.0 | 7.5 |
| 160.0 | 7.5 |
| 160.0 | 7.5 |
| 161.0 | 7.5 |
| 161.0 | 7.5 |
| 161.0 | 7.5 |
| 161.0 | 7.5 |
| 161.0 | 7.5 |
| 161.0 | 7.5 |
| 161.0 | 7.5 |
| 161.0 | 7.5 |
| 161.0 | 7.5 |
| 162.0 | 7.5 |
| 162.0 | 7.5 |
| 162.0 | 7.5 |
| 162.0 | 7.5 |
| 162.0 | 7.5 |
| 162.0 | 7.5 |
| 162.0 | 7.5 |
| 162.0 | 7.5 |
| 162.0 | 7.5 |
| 162.0 | 7.5 |
| 162.0 | 7.5 |
| 163.0 | 7.5 |
| 163.0 | 7.5 |
| 163.0 | 7.5 |
| 163.0 | 7.5 |
| 163.0 | 7.5 |
| 163.0 | 7.5 |
| 163.0 | 7.5 |
| 163.0 | 7.5 |
| 163.0 | 7.5 |
| 164.0 | 7.5 |
| 164.0 | 7.5 |
| 164.0 | 7.5 |
| 164.0 | 7.5 |
| 164.0 | 7.5 |
| 164.0 | 7.5 |
| 164.0 | 7.5 |
| 164.0 | 7.5 |
| 164.0 | 7.5 |
| 164.0 | 7.5 |
| 164.0 | 7.5 |
| 165.0 | 7.5 |
| 165.0 | 7.5 |
| 165.0 | 7.5 |
| 165.0 | 7.5 |
| 165.0 | 7.5 |
| 165.0 | 7.5 |
| 165.0 | 7.5 |
| 165.0 | 7.5 |
| 165.0 | 7.5 |
| 166.0 | 7.5 |
| 166.0 | 7.5 |
| 166.0 | 7.5 |
| 166.0 | 7.5 |
| 166.0 | 7.5 |
| 166.0 | 7.5 |
| 166.0 | 7.5 |
| 166.0 | 7.5 |
| 166.0 | 7.5 |
| 166.0 | 7.5 |
| 166.0 | 7.5 |
| 167.0 | 7.5 |
| 167.0 | 7.5 |
| 167.0 | 7.5 |
| 167.0 | 7.5 |
| 167.0 | 7.5 |
| 167.0 | 7.5 |
| 167.0 | 7.5 |
| 167.0 | 7.5 |
| 167.0 | 7.5 |
| 168.0 | 7.5 |
| 168.0 | 7.5 |
| 168.0 | 7.5 |
| 168.0 | 7.5 |
| 168.0 | 7.5 |
| 168.0 | 7.5 |
| 168.0 | 7.5 |
| 168.0 | 7.5 |
| 168.0 | 7.5 |
| 168.0 | 7.5 |
| 168.0 | 7.5 |
| 169.0 | 7.5 |
| 169.0 | 7.5 |
| 169.0 | 7.5 |
| 169.0 | 7.5 |
| 169.0 | 7.5 |
| 169.0 | 7.5 |
| 169.0 | 7.5 |
| 169.0 | 7.5 |
| 169.0 | 7.5 |
| 170.0 | 7.5 |
| 170.0 | 7.5 |
| 170.0 | 7.5 |
| 170.0 | 7.5 |
| 170.0 | 7.5 |
| 170.0 | 7.5 |
| 170.0 | 7.5 |
| 170.0 | 7.5 |
| 170.0 | 7.5 |
| 170.0 | 7.5 |
| 170.0 | 7.5 |
| 171.0 | 7.5 |
| 171.0 | 7.5 |
| 171.0 | 7.5 |
| 171.0 | 7.5 |
| 171.0 | 7.5 |
| 171.0 | 7.5 |
| 171.0 | 7.5 |
| 171.0 | 7.5 |
| 171.0 | 7.5 |
| 172.0 | 7.5 |
| 172.0 | 7.5 |
| 172.0 | 7.5 |
| 172.0 | 7.5 |
| 172.0 | 7.5 |
| 172.0 | 7.5 |
| 172.0 | 7.5 |
| 172.0 | 7.5 |
| 172.0 | 7.5 |
| 172.0 | 7.5 |
| 172.0 | 7.5 |
| 173.0 | 7.5 |
| 173.0 | 7.5 |
| 173.0 | 7.5 |
| 173.0 | 7.5 |
| 173.0 | 7.5 |
| 173.0 | 7.5 |
| 173.0 | 7.5 |
| 173.0 | 7.5 |
| 173.0 | 7.5 |
| 174.0 | 7.5 |
| 174.0 | 7.5 |
| 174.0 | 7.5 |
| 174.0 | 7.5 |
| 174.0 | 7.5 |
| 174.0 | 7.5 |
| 174.0 | 7.5 |
| 174.0 | 7.5 |
| 174.0 | 7.5 |
| 174.0 | 7.5 |
| 174.0 | 7.5 |
| 175.0 | 7.5 |
| 175.0 | 7.5 |
| 175.0 | 7.5 |
| 175.0 | 7.5 |
| 175.0 | 7.5 |
| 175.0 | 7.5 |
| 175.0 | 7.5 |
| 175.0 | 7.5 |
| 175.0 | 7.5 |
| 176.0 | 7.5 |
| 176.0 | 7.5 |
| 176.0 | 7.5 |
| 176.0 | 7.5 |
| 176.0 | 7.5 |
| 176.0 | 7.5 |
| 176.0 | 7.5 |
| 176.0 | 7.5 |
| 176.0 | 7.5 |
| 176.0 | 7.5 |
| 176.0 | 7.5 |
| 177.0 | 7.5 |
| 177.0 | 7.5 |
| 177.0 | 7.5 |
| 177.0 | 7.5 |
| 177.0 | 7.5 |
| 177.0 | 7.5 |
| 177.0 | 7.5 |
| 177.0 | 7.5 |
| 177.0 | 7.5 |
| 178.0 | 7.5 |
| 178.0 | 7.5 |
| 178.0 | 7.5 |
| 178.0 | 7.5 |
| 178.0 | 7.5 |
| 178.0 | 7.5 |
| 178.0 | 7.5 |
| 178.0 | 7.5 |
| 178.0 | 7.5 |
| 178.0 | 7.5 |
| 178.0 | 7.5 |
| 179.0 | 7.5 |
| 179.0 | 7.5 |
| 179.0 | 7.5 |
| 179.0 | 7.5 |
| 179.0 | 7.5 |
| 179.0 | 7.5 |
| 179.0 | 7.5 |
| 179.0 | 7.5 |
| 179.0 | 7.5 |
| 180.0 | 7.5 |
| 180.0 | 7.5 |
| 180.0 | 7.5 |
| 180.0 | 7.5 |
| 180.0 | 7.5 |
| 180.0 | 7.5 |
| 180.0 | 7.5 |
| 180.0 | 7.5 |
| 180.0 | 7.5 |
| 180.0 | 7.5 |
| 180.0 | 7.5 |
| 181.0 | 7.5 |
| 181.0 | 7.5 |
| 181.0 | 7.5 |
| 181.0 | 7.5 |
| 181.0 | 7.5 |
| 181.0 | 7.5 |
| 181.0 | 7.5 |
| 181.0 | 7.5 |
| 181.0 | 7.5 |
| 182.0 | 7.5 |
| 182.0 | 7.5 |
| 182.0 | 7.5 |
| 182.0 | 7.5 |
| 182.0 | 7.5 |
| 182.0 | 7.5 |
| 182.0 | 7.5 |
| 182.0 | 7.5 |
| 182.0 | 7.5 |
| 182.0 | 7.5 |
| 182.0 | 7.5 |
| 183.0 | 7.5 |
| 183.0 | 7.5 |
| 183.0 | 7.5 |
| 183.0 | 7.5 |
| 183.0 | 7.5 |
| 183.0 | 7.5 |
| 183.0 | 7.5 |
| 183.0 | 7.5 |
| 183.0 | 7.5 |
| 184.0 | 7.5 |
| 184.0 | 7.5 |
| 184.0 | 7.5 |
| 184.0 | 7.5 |
| 184.0 | 7.5 |
| 184.0 | 7.5 |
| 184.0 | 7.5 |
| 184.0 | 7.5 |
| 184.0 | 7.5 |
| 184.0 | 7.5 |
| 184.0 | 7.5 |
| 185.0 | 7.5 |
| 185.0 | 7.5 |
| 185.0 | 7.5 |
| 185.0 | 7.5 |
| 185.0 | 7.5 |
| 185.0 | 7.5 |
| 185.0 | 7.5 |
| 185.0 | 7.5 |
| 185.0 | 7.5 |
| 186.0 | 7.5 |
| 186.0 | 7.5 |
| 186.0 | 7.5 |
| 186.0 | 7.5 |
| 186.0 | 7.5 |
| 186.0 | 7.5 |
| 186.0 | 7.5 |
| 186.0 | 7.5 |
| 186.0 | 7.5 |
| 186.0 | 7.5 |
| 186.0 | 7.5 |
| 187.0 | 7.5 |
| 187.0 | 7.5 |
| 187.0 | 7.5 |
| 187.0 | 7.5 |
| 187.0 | 7.5 |
| 187.0 | 7.5 |
| 187.0 | 7.5 |
| 187.0 | 7.5 |
| 187.0 | 7.5 |
| 188.0 | 7.5 |
| 188.0 | 7.5 |
| 188.0 | 7.5 |
| 188.0 | 7.5 |
| 188.0 | 7.5 |
| 188.0 | 7.5 |
| 188.0 | 7.5 |
| 188.0 | 7.5 |
| 188.0 | 7.5 |
| 188.0 | 7.5 |
| 188.0 | 7.5 |
| 189.0 | 7.5 |
| 189.0 | 7.5 |
| 189.0 | 7.5 |
| 189.0 | 7.5 |
| 189.0 | 7.5 |
| 189.0 | 7.5 |
| 189.0 | 7.5 |
| 189.0 | 7.5 |
| 189.0 | 7.5 |
| 190.0 | 7.5 |
| 190.0 | 7.5 |
| 190.0 | 7.5 |
| 190.0 | 7.5 |
| 190.0 | 7.5 |
| 190.0 | 7.5 |
| 190.0 | 7.5 |
| 190.0 | 7.5 |
| 190.0 | 7.5 |
| 190.0 | 7.5 |
| 190.0 | 7.5 |
| 191.0 | 7.5 |
| 191.0 | 7.5 |
| 191.0 | 7.5 |
| 191.0 | 7.5 |
| 191.0 | 7.5 |
| 191.0 | 7.5 |
| 191.0 | 7.5 |
| 191.0 | 7.5 |
| 191.0 | 7.5 |
| 192.0 | 7.5 |
| 192.0 | 7.5 |
| 192.0 | 7.5 |
| 192.0 | 7.5 |
| 192.0 | 7.5 |
| 192.0 | 7.5 |
| 192.0 | 7.5 |
| 192.0 | 7.5 |
| 192.0 | 7.5 |
| 192.0 | 7.5 |
| 192.0 | 7.5 |
| 193.0 | 7.5 |
| 193.0 | 7.5 |
| 193.0 | 7.5 |
| 193.0 | 7.5 |
| 193.0 | 7.5 |
| 193.0 | 7.5 |
| 193.0 | 7.5 |
| 193.0 | 7.5 |
| 193.0 | 7.5 |
| 194.0 | 7.5 |
| 194.0 | 7.5 |
| 194.0 | 7.5 |
| 194.0 | 7.5 |
| 194.0 | 7.5 |
| 194.0 | 7.5 |
| 194.0 | 7.5 |
| 194.0 | 7.5 |
| 194.0 | 7.5 |
| 194.0 | 7.5 |
| 194.0 | 7.5 |
| 195.0 | 7.5 |
| 195.0 | 7.5 |
| 195.0 | 7.5 |
| 195.0 | 7.5 |
| 195.0 | 7.5 |
| 195.0 | 7.5 |
| 195.0 | 7.5 |
| 195.0 | 7.5 |
| 195.0 | 7.5 |
| 196.0 | 7.5 |
| 196.0 | 7.5 |
| 196.0 | 7.5 |
| 196.0 | 7.5 |
| 196.0 | 7.5 |
| 196.0 | 7.5 |
| 196.0 | 7.5 |
| 196.0 | 7.5 |
| 196.0 | 7.5 |
| 196.0 | 7.5 |
| 196.0 | 7.5 |
| 197.0 | 7.5 |
| 197.0 | 7.5 |
| 197.0 | 7.5 |
| 197.0 | 7.5 |
| 197.0 | 7.5 |
| 197.0 | 7.5 |
| 197.0 | 7.5 |
| 197.0 | 7.5 |
| 197.0 | 7.5 |
| 198.0 | 7.5 |
| 198.0 | 7.5 |
| 198.0 | 7.5 |
| 198.0 | 7.5 |
| 198.0 | 7.5 |
| 198.0 | 7.5 |
| 198.0 | 7.5 |
| 198.0 | 7.5 |
| 198.0 | 7.5 |
| 198.0 | 7.5 |
| 198.0 | 7.5 |
| 199.0 | 7.5 |
| 199.0 | 7.5 |
| 199.0 | 7.5 |
| 199.0 | 7.5 |
| 199.0 | 7.5 |
| 199.0 | 7.5 |
| 199.0 | 7.5 |
| 199.0 | 7.5 |
| 199.0 | 7.5 |
| 200.0 | 7.5 |
| 200.0 | 7.5 |
| 200.0 | 7.5 |
| 200.0 | 7.5 |
| 200.0 | 7.5 |
| 200.0 | 7.5 |
| 200.0 | 7.5 |
| 200.0 | 7.5 |
| 200.0 | 7.5 |
| 200.0 | 7.5 |
| 200.0 | 7.5 |
| 201.0 | 7.5 |
| 201.0 | 7.5 |
| 201.0 | 7.5 |
| 201.0 | 7.5 |
| 201.0 | 7.5 |
| 201.0 | 7.5 |
| 201.0 | 7.5 |
| 201.0 | 7.5 |
| 201.0 | 7.5 |
| 202.0 | 7.5 |
| 202.0 | 7.5 |
| 202.0 | 7.5 |
| 202.0 | 7.5 |
| 202.0 | 7.5 |
| 202.0 | 7.5 |
| 202.0 | 7.5 |
| 202.0 | 7.5 |
| 202.0 | 7.5 |
| 202.0 | 7.5 |
| 202.0 | 7.5 |
| 203.0 | 7.5 |
| 203.0 | 7.5 |
| 203.0 | 7.5 |
| 203.0 | 7.5 |
| 203.0 | 7.5 |
| 203.0 | 7.5 |
| 203.0 | 7.5 |
| 203.0 | 7.5 |
| 203.0 | 7.5 |
| 204.0 | 7.5 |
| 204.0 | 7.5 |
| 204.0 | 7.5 |
| 204.0 | 7.5 |
| 204.0 | 7.5 |
| 204.0 | 7.5 |
| 204.0 | 7.5 |
| 204.0 | 7.5 |
| 204.0 | 7.5 |
| 204.0 | 7.5 |
| 204.0 | 7.5 |
| 205.0 | 7.5 |
| 205.0 | 7.5 |
| 205.0 | 7.5 |
| 205.0 | 7.5 |
| 205.0 | 7.5 |
| 205.0 | 7.5 |
| 205.0 | 7.5 |
| 205.0 | 7.5 |
| 205.0 | 7.5 |
| 206.0 | 7.5 |
| 206.0 | 7.5 |
| 206.0 | 7.5 |
| 206.0 | 7.5 |
| 206.0 | 7.5 |
| 206.0 | 7.5 |
| 206.0 | 7.5 |
| 206.0 | 7.5 |
| 206.0 | 7.5 |
| 206.0 | 7.5 |
| 206.0 | 7.5 |
| 207.0 | 7.5 |
| 207.0 | 7.5 |
| 207.0 | 7.5 |
| 207.0 | 7.5 |
| 207.0 | 7.5 |
| 207.0 | 7.5 |
| 207.0 | 7.5 |
| 207.0 | 7.5 |
| 207.0 | 7.5 |
| 208.0 | 7.5 |
| 208.0 | 7.5 |
| 208.0 | 7.5 |
| 208.0 | 7.5 |
| 208.0 | 7.5 |
| 208.0 | 7.5 |
| 208.0 | 7.5 |
| 208.0 | 7.5 |
| 208.0 | 7.5 |
| 208.0 | 7.5 |
| 208.0 | 7.5 |
| 209.0 | 7.5 |
| 209.0 | 7.5 |
| 209.0 | 7.5 |
| 209.0 | 7.5 |
| 209.0 | 7.5 |
| 209.0 | 7.5 |
| 209.0 | 7.5 |
| 209.0 | 7.5 |
| 209.0 | 7.5 |
| 210.0 | 7.5 |
| 210.0 | 7.5 |
| 210.0 | 7.5 |
| 210.0 | 7.5 |
| 210.0 | 7.5 |
| 210.0 | 7.5 |
| 210.0 | 7.5 |
| 210.0 | 7.5 |
| 210.0 | 7.5 |
| 210.0 | 7.5 |
| 210.0 | 7.5 |
| 211.0 | 7.5 |
| 211.0 | 7.5 |
| 211.0 | 7.5 |
| 211.0 | 7.5 |
| 211.0 | 7.5 |
| 211.0 | 7.5 |
| 211.0 | 7.5 |
| 211.0 | 7.5 |
| 211.0 | 7.5 |
| 212.0 | 7.5 |
| 212.0 | 7.5 |
| 212.0 | 7.5 |
| 212.0 | 7.5 |
| 212.0 | 7.5 |
| 212.0 | 7.5 |
| 212.0 | 7.5 |
| 212.0 | 7.5 |
| 212.0 | 7.5 |
| 212.0 | 7.5 |
| 212.0 | 7.5 |
| 213.0 | 7.5 |
| 213.0 | 7.5 |
| 213.0 | 7.5 |
| 213.0 | 7.5 |
| 213.0 | 7.5 |
| 213.0 | 7.5 |
| 213.0 | 7.5 |
| 213.0 | 7.5 |
| 213.0 | 7.5 |
| 214.0 | 7.5 |
| 214.0 | 7.5 |
| 214.0 | 7.5 |
| 214.0 | 7.5 |
| 214.0 | 7.5 |
| 214.0 | 7.5 |
| 214.0 | 7.5 |
| 214.0 | 7.5 |
| 214.0 | 7.5 |
| 214.0 | 7.5 |
| 214.0 | 7.5 |
| 215.0 | 7.5 |
| 215.0 | 7.5 |
| 215.0 | 7.5 |
| 215.0 | 7.5 |
| 215.0 | 7.5 |
| 215.0 | 7.5 |
| 215.0 | 7.5 |
| 215.0 | 7.5 |
| 215.0 | 7.5 |
| 216.0 | 7.5 |
| 216.0 | 7.5 |
| 216.0 | 7.5 |
| 216.0 | 7.5 |
| 216.0 | 7.5 |
| 216.0 | 7.5 |
| 216.0 | 7.5 |
| 216.0 | 7.5 |
| 216.0 | 7.5 |
| 216.0 | 7.5 |
| 216.0 | 7.5 |
| 217.0 | 7.5 |
| 217.0 | 7.5 |
| 217.0 | 7.5 |
| 217.0 | 7.5 |
| 217.0 | 7.5 |
| 217.0 | 7.5 |
| 217.0 | 7.5 |
| 217.0 | 7.5 |
| 217.0 | 7.5 |
| 218.0 | 7.5 |
| 218.0 | 7.5 |
| 218.0 | 7.5 |
| 218.0 | 7.5 |
| 218.0 | 7.5 |
| 218.0 | 7.5 |
| 218.0 | 7.5 |
| 218.0 | 7.5 |
| 218.0 | 7.5 |
| 218.0 | 7.5 |
| 218.0 | 7.5 |
| 219.0 | 7.5 |
| 219.0 | 7.5 |
| 219.0 | 7.5 |
| 219.0 | 7.5 |
| 219.0 | 7.5 |
| 219.0 | 7.5 |
| 219.0 | 7.5 |
| 219.0 | 7.5 |
| 219.0 | 7.5 |
| 220.0 | 7.5 |
| 220.0 | 7.5 |
| 220.0 | 7.5 |
| 220.0 | 7.5 |
| 220.0 | 7.5 |
| 220.0 | 7.5 |
| 220.0 | 7.5 |
| 220.0 | 7.5 |
| 220.0 | 7.5 |
| 220.0 | 7.5 |
| 220.0 | 7.5 |
| 221.0 | 7.5 |
| 221.0 | 7.5 |
| 221.0 | 7.5 |
| 221.0 | 7.5 |
| 221.0 | 7.5 |
| 221.0 | 7.5 |
| 221.0 | 7.5 |
| 221.0 | 7.5 |
| 221.0 | 7.5 |
| 222.0 | 7.5 |
| 222.0 | 7.5 |
| 222.0 | 7.5 |
| 222.0 | 7.5 |
| 222.0 | 7.5 |
| 222.0 | 7.5 |
| 222.0 | 7.5 |
| 222.0 | 7.5 |
| 222.0 | 7.5 |
| 222.0 | 7.5 |
| 222.0 | 7.5 |
| 223.0 | 7.5 |
| 223.0 | 7.5 |
| 223.0 | 7.5 |
| 223.0 | 7.5 |
| 223.0 | 7.5 |
| 223.0 | 7.5 |
| 223.0 | 7.5 |
| 223.0 | 7.5 |
| 223.0 | 7.5 |
| 224.0 | 7.5 |
| 224.0 | 7.5 |
| 224.0 | 7.5 |
| 224.0 | 7.5 |
| 224.0 | 7.5 |
| 224.0 | 7.5 |
| 224.0 | 7.5 |
| 224.0 | 7.5 |
| 224.0 | 7.5 |
| 224.0 | 7.5 |
| 224.0 | 7.5 |
| 225.0 | 7.5 |
| 225.0 | 7.5 |
| 225.0 | 7.5 |
| 225.0 | 7.5 |
| 225.0 | 7.5 |
| 225.0 | 7.5 |
| 225.0 | 7.5 |
| 225.0 | 7.5 |
| 225.0 | 7.5 |
| 226.0 | 7.5 |
| 226.0 | 7.5 |
| 226.0 | 7.5 |
| 226.0 | 7.5 |
| 226.0 | 7.5 |
| 226.0 | 7.5 |
| 226.0 | 7.5 |
| 226.0 | 7.5 |
| 226.0 | 7.5 |
| 226.0 | 7.5 |
| 226.0 | 7.5 |
| 227.0 | 7.5 |
| 227.0 | 7.5 |
| 227.0 | 7.5 |
| 227.0 | 7.5 |
| 227.0 | 7.5 |
| 227.0 | 7.5 |
| 227.0 | 7.5 |
| 227.0 | 7.5 |
| 227.0 | 7.5 |
| 228.0 | 7.5 |
| 228.0 | 7.5 |
| 228.0 | 7.5 |
| 228.0 | 7.5 |
| 228.0 | 7.5 |
| 228.0 | 7.5 |
| 228.0 | 7.5 |
| 228.0 | 7.5 |
| 228.0 | 7.5 |
| 228.0 | 7.5 |
| 228.0 | 7.5 |
| 229.0 | 7.5 |
| 229.0 | 7.5 |
| 229.0 | 7.5 |
| 229.0 | 7.5 |
| 229.0 | 7.5 |
| 229.0 | 7.5 |
| 229.0 | 7.5 |
| 229.0 | 7.5 |
| 229.0 | 7.5 |
| 230.0 | 7.5 |
| 230.0 | 7.5 |
| 230.0 | 7.5 |
| 230.0 | 7.5 |
| 230.0 | 7.5 |
| 230.0 | 7.5 |
| 230.0 | 7.5 |
| 230.0 | 7.5 |
| 230.0 | 7.5 |
| 230.0 | 7.5 |
| 230.0 | 7.5 |
| 231.0 | 7.5 |
| 231.0 | 7.5 |
| 231.0 | 7.5 |
| 231.0 | 7.5 |
| 231.0 | 7.5 |
| 231.0 | 7.5 |
| 231.0 | 7.5 |
| 231.0 | 7.5 |
| 231.0 | 7.5 |
| 232.0 | 7.5 |
| 232.0 | 7.5 |
| 232.0 | 7.5 |
| 232.0 | 7.5 |
| 232.0 | 7.5 |
| 232.0 | 7.5 |
| 232.0 | 7.5 |
| 232.0 | 7.5 |
| 232.0 | 7.5 |
| 232.0 | 7.5 |
| 232.0 | 7.5 |
| 233.0 | 7.5 |
| 233.0 | 7.5 |
| 233.0 | 7.5 |
| 233.0 | 7.5 |
| 233.0 | 7.5 |
| 233.0 | 7.5 |
| 233.0 | 7.5 |
| 233.0 | 7.5 |
| 233.0 | 7.5 |
| 234.0 | 7.5 |
| 234.0 | 7.5 |
| 234.0 | 7.5 |
| 234.0 | 7.5 |
| 234.0 | 7.5 |
| 234.0 | 7.5 |
| 234.0 | 7.5 |
| 234.0 | 7.5 |
| 234.0 | 7.5 |
| 234.0 | 7.5 |
| 234.0 | 7.5 |
| 235.0 | 7.5 |
| 235.0 | 7.5 |
| 235.0 | 7.5 |
| 235.0 | 7.5 |
| 235.0 | 7.5 |
| 235.0 | 7.5 |
| 235.0 | 7.5 |
| 235.0 | 7.5 |
| 235.0 | 7.5 |
| 236.0 | 7.5 |
| 236.0 | 7.5 |
| 236.0 | 7.5 |
| 236.0 | 7.5 |
| 236.0 | 7.5 |
| 236.0 | 7.5 |
| 236.0 | 7.5 |
| 236.0 | 7.5 |
| 236.0 | 7.5 |
| 236.0 | 7.5 |
| 236.0 | 7.5 |
| 237.0 | 7.5 |
| 237.0 | 7.5 |
| 237.0 | 7.5 |
| 237.0 | 7.5 |
| 237.0 | 7.5 |
| 237.0 | 7.5 |
| 237.0 | 7.5 |
| 237.0 | 7.5 |
| 237.0 | 7.5 |
| 238.0 | 7.5 |
| 238.0 | 7.5 |
| 238.0 | 7.5 |
| 238.0 | 7.5 |
| 238.0 | 7.5 |
| 238.0 | 7.5 |
| 238.0 | 7.5 |
| 238.0 | 7.5 |
| 238.0 | 7.5 |
| 238.0 | 7.5 |
| 238.0 | 7.5 |
| 239.0 | 7.5 |
| 239.0 | 7.5 |
| 239.0 | 7.5 |
| 239.0 | 7.5 |
| 239.0 | 7.5 |
| 239.0 | 7.5 |
| 239.0 | 7.5 |
| 239.0 | 7.5 |
| 239.0 | 7.5 |
| 240.0 | 7.5 |
| 240.0 | 7.5 |
| 240.0 | 7.5 |
| 240.0 | 7.5 |
| 240.0 | 7.5 |
| 240.0 | 7.5 |
| 240.0 | 7.5 |
| 240.0 | 7.5 |
| 240.0 | 7.5 |
| 240.0 | 7.5 |
| 240.0 | 7.5 |
| 241.0 | 7.5 |
| 241.0 | 7.5 |
| 241.0 | 7.5 |
| 241.0 | 7.5 |
| 241.0 | 7.5 |
| 241.0 | 7.5 |
| 241.0 | 7.5 |
| 241.0 | 7.5 |
| 241.0 | 7.5 |
| 242.0 | 7.5 |
| 242.0 | 7.5 |
| 242.0 | 7.5 |
| 242.0 | 7.5 |
| 242.0 | 7.5 |
| 242.0 | 7.5 |
| 242.0 | 7.5 |
| 242.0 | 7.5 |
| 242.0 | 7.5 |
| 242.0 | 7.5 |
| 242.0 | 7.5 |
| 243.0 | 7.5 |
| 243.0 | 7.5 |
| 243.0 | 7.5 |
| 243.0 | 7.5 |
| 243.0 | 7.5 |
| 243.0 | 7.5 |
| 243.0 | 7.5 |
| 243.0 | 7.5 |
| 243.0 | 7.5 |
| 244.0 | 7.5 |
| 244.0 | 7.5 |
| 244.0 | 7.5 |
| 244.0 | 7.5 |
| 244.0 | 7.5 |
| 244.0 | 7.5 |
| 244.0 | 7.5 |
| 244.0 | 7.5 |
| 244.0 | 7.5 |
| 244.0 | 7.5 |
| 244.0 | 7.5 |
| 245.0 | 7.5 |
| 245.0 | 7.5 |
| 245.0 | 7.5 |
| 245.0 | 7.5 |
| 245.0 | 7.5 |
| 245.0 | 7.5 |
| 245.0 | 7.5 |
| 245.0 | 7.5 |
| 245.0 | 7.5 |
| 246.0 | 7.5 |
| 246.0 | 7.5 |
| 246.0 | 7.5 |
| 246.0 | 7.5 |
| 246.0 | 7.5 |
| 246.0 | 7.5 |
| 246.0 | 7.5 |
| 246.0 | 7.5 |
| 246.0 | 7.5 |
| 246.0 | 7.5 |
| 246.0 | 7.5 |
| 247.0 | 7.5 |
| 247.0 | 7.5 |
| 247.0 | 7.5 |
| 247.0 | 7.5 |
| 247.0 | 7.5 |
| 247.0 | 7.5 |
| 247.0 | 7.5 |
| 247.0 | 7.5 |
| 247.0 | 7.5 |
| 248.0 | 7.5 |
| 248.0 | 7.5 |
| 248.0 | 7.5 |
| 248.0 | 7.5 |
| 248.0 | 7.5 |
| 248.0 | 7.5 |
| 248.0 | 7.5 |
| 248.0 | 7.5 |
| 248.0 | 7.5 |
| 248.0 | 7.5 |
| 248.0 | 7.5 |
| 249.0 | 7.5 |
| 249.0 | 7.5 |
| 249.0 | 7.5 |
| 249.0 | 7.5 |
| 249.0 | 7.5 |
| 249.0 | 7.5 |
| 249.0 | 7.5 |
| 249.0 | 7.5 |
| 249.0 | 7.5 |
| 250.0 | 7.5 |
| 250.0 | 7.5 |
| 250.0 | 7.5 |
| 250.0 | 7.5 |
| 250.0 | 7.5 |
| 250.0 | 7.5 |
| 250.0 | 7.5 |
| 250.0 | 7.5 |
| 250.0 | 7.5 |
| 250.0 | 7.5 |
| 250.0 | 7.5 |
| 251.0 | 7.5 |
| 251.0 | 7.5 |
| 251.0 | 7.5 |
| 251.0 | 7.5 |
| 251.0 | 7.5 |
| 251.0 | 7.5 |
| 251.0 | 7.5 |
| 251.0 | 7.5 |
| 251.0 | 7.5 |
| 252.0 | 7.5 |
| 252.0 | 7.5 |
| 252.0 | 7.5 |
| 252.0 | 7.5 |
| 252.0 | 7.5 |
| 252.0 | 7.5 |
| 252.0 | 7.5 |
| 252.0 | 7.5 |
| 252.0 | 7.5 |
| 252.0 | 7.5 |
| 252.0 | 7.5 |
| 253.0 | 7.5 |
| 253.0 | 7.5 |
| 253.0 | 7.5 |
| 253.0 | 7.5 |
| 253.0 | 7.5 |
| 253.0 | 7.5 |
| 253.0 | 7.5 |
| 253.0 | 7.5 |
| 253.0 | 7.5 |
| 254.0 | 7.5 |
| 254.0 | 7.5 |
| 254.0 | 7.5 |
| 254.0 | 7.5 |
| 254.0 | 7.5 |
| 254.0 | 7.5 |
| 254.0 | 7.5 |
| 254.0 | 7.5 |
| 254.0 | 7.5 |
| 254.0 | 7.5 |
| 254.0 | 7.5 |
| 255.0 | 7.5 |
| 255.0 | 7.5 |
| 255.0 | 7.5 |
| 255.0 | 7.5 |
| 255.0 | 7.5 |
| 255.0 | 7.5 |
| 255.0 | 7.5 |
| 255.0 | 7.5 |
| 255.0 | 7.5 |
| 256.0 | 7.5 |
| 256.0 | 7.5 |
| 256.0 | 7.5 |
| 256.0 | 7.5 |
| 256.0 | 7.5 |
| 256.0 | 7.5 |
| 256.0 | 7.5 |
| 256.0 | 7.5 |
| 256.0 | 7.5 |
| 256.0 | 7.5 |
| 257.0 | 7.5 |
| 257.0 | 7.5 |
| 257.0 | 7.5 |
| 257.0 | 7.5 |
| 257.0 | 7.5 |
| 257.0 | 7.5 |
| 257.0 | 7.5 |
| 257.0 | 7.5 |
| 257.0 | 7.5 |
| 257.0 | 7.5 |
| 258.0 | 7.5 |
| 258.0 | 7.5 |
| 258.0 | 7.5 |
| 258.0 | 7.5 |
| 258.0 | 7.5 |
| 258.0 | 7.5 |
| 258.0 | 7.5 |
| 258.0 | 7.5 |
| 258.0 | 7.5 |
| 258.0 | 7.5 |
| 259.0 | 7.5 |
| 259.0 | 7.5 |
| 259.0 | 7.5 |
| 259.0 | 7.5 |
| 259.0 | 7.5 |
| 259.0 | 7.5 |
| 259.0 | 7.5 |
| 259.0 | 7.5 |
| 259.0 | 7.5 |
| 259.0 | 7.5 |
| 260.0 | 7.5 |
| 260.0 | 7.5 |
| 260.0 | 7.5 |
| 260.0 | 7.5 |
| 260.0 | 7.5 |
| 260.0 | 7.5 |
| 260.0 | 7.5 |
| 260.0 | 7.5 |
| 260.0 | 7.5 |
| 260.0 | 7.5 |
| 261.0 | 7.5 |
| 261.0 | 7.5 |
| 261.0 | 7.5 |
| 261.0 | 7.5 |
| 261.0 | 7.5 |
| 261.0 | 7.5 |
| 261.0 | 7.5 |
| 261.0 | 7.5 |
| 261.0 | 7.5 |
| 261.0 | 7.5 |
| 262.0 | 7.5 |
| 262.0 | 7.5 |
| 262.0 | 7.5 |
| 262.0 | 7.5 |
| 262.0 | 7.5 |
| 262.0 | 7.5 |
| 262.0 | 7.5 |
| 262.0 | 7.5 |
| 262.0 | 7.5 |
| 262.0 | 7.5 |
| 263.0 | 7.5 |
| 263.0 | 7.5 |
| 263.0 | 7.5 |
| 263.0 | 7.5 |
| 263.0 | 7.5 |
| 263.0 | 7.5 |
| 263.0 | 7.5 |
| 263.0 | 7.5 |
| 263.0 | 7.5 |
| 263.0 | 7.5 |
| 264.0 | 7.5 |
| 264.0 | 7.5 |
| 264.0 | 7.5 |
| 264.0 | 7.5 |
| 264.0 | 7.5 |
| 264.0 | 7.5 |
| 264.0 | 7.5 |
| 264.0 | 7.5 |
| 264.0 | 7.5 |
| 264.0 | 7.5 |
| 265.0 | 7.5 |
| 265.0 | 7.5 |
| 265.0 | 7.5 |
| 265.0 | 7.5 |
| 265.0 | 7.5 |
| 265.0 | 7.5 |
| 265.0 | 7.5 |
| 265.0 | 7.5 |
| 265.0 | 7.5 |
| 265.0 | 7.5 |
| 266.0 | 7.5 |
| 266.0 | 7.5 |
| 266.0 | 7.5 |
| 266.0 | 7.5 |
| 266.0 | 7.5 |
| 266.0 | 7.5 |
| 266.0 | 7.5 |
| 266.0 | 7.5 |
| 266.0 | 7.5 |
| 266.0 | 7.5 |
| 267.0 | 7.5 |
| 267.0 | 7.5 |
| 267.0 | 7.5 |
| 267.0 | 7.5 |
| 267.0 | 7.5 |
| 267.0 | 7.5 |
| 267.0 | 7.5 |
| 267.0 | 7.5 |
| 267.0 | 7.5 |
| 267.0 | 7.5 |
| 268.0 | 7.5 |
| 268.0 | 7.5 |
| 268.0 | 7.5 |
| 268.0 | 7.5 |
| 268.0 | 7.5 |
| 268.0 | 7.5 |
| 268.0 | 7.5 |
| 268.0 | 7.5 |
| 268.0 | 7.5 |
| 268.0 | 7.5 |
| 269.0 | 7.5 |
| 269.0 | 7.5 |
| 269.0 | 7.5 |
| 269.0 | 7.5 |
| 269.0 | 7.5 |
| 269.0 | 7.5 |
| 269.0 | 7.5 |
| 269.0 | 7.5 |
| 269.0 | 7.5 |
| 269.0 | 7.5 |
| 270.0 | 7.5 |
| 270.0 | 7.5 |
| 270.0 | 7.5 |
| 270.0 | 7.5 |
| 270.0 | 7.5 |
| 270.0 | 7.5 |
| 270.0 | 7.5 |
| 270.0 | 7.5 |
| 270.0 | 7.5 |
| 270.0 | 7.5 |
| 271.0 | 7.5 |
| 271.0 | 7.5 |
| 271.0 | 7.5 |
| 271.0 | 7.5 |
| 271.0 | 7.5 |
| 271.0 | 7.5 |
| 271.0 | 7.5 |
| 271.0 | 7.5 |
| 271.0 | 7.5 |
| 271.0 | 7.5 |
| 272.0 | 7.5 |
| 272.0 | 7.5 |
| 272.0 | 7.5 |
| 272.0 | 7.5 |
| 272.0 | 7.5 |
| 272.0 | 7.5 |
| 272.0 | 7.5 |
| 272.0 | 7.5 |
| 272.0 | 7.5 |
| 272.0 | 7.5 |
| 273.0 | 7.5 |
| 273.0 | 7.5 |
| 273.0 | 7.5 |
| 273.0 | 7.5 |
| 273.0 | 7.5 |
| 273.0 | 7.5 |
| 273.0 | 7.5 |
| 273.0 | 7.5 |
| 273.0 | 7.5 |
| 273.0 | 7.5 |
| 274.0 | 7.5 |
| 274.0 | 7.5 |
| 274.0 | 7.5 |
| 274.0 | 7.5 |
| 274.0 | 7.5 |
| 274.0 | 7.5 |
| 274.0 | 7.5 |
| 274.0 | 7.5 |
| 274.0 | 7.5 |
| 274.0 | 7.5 |
| 275.0 | 7.5 |
| 275.0 | 7.5 |
| 275.0 | 7.5 |
| 275.0 | 7.5 |
| 275.0 | 7.5 |
| 275.0 | 7.5 |
| 275.0 | 7.5 |
| 275.0 | 7.5 |
| 275.0 | 7.5 |
| 275.0 | 7.5 |
| 276.0 | 7.5 |
| 276.0 | 7.5 |
| 276.0 | 7.5 |
| 276.0 | 7.5 |
| 276.0 | 7.5 |
| 276.0 | 7.5 |
| 276.0 | 7.5 |
| 276.0 | 7.5 |
| 276.0 | 7.5 |
| 276.0 | 7.5 |
| 277.0 | 7.5 |
| 277.0 | 7.5 |
| 277.0 | 7.5 |
| 277.0 | 7.5 |
| 277.0 | 7.5 |
| 277.0 | 7.5 |
| 277.0 | 7.5 |
| 277.0 | 7.5 |
| 277.0 | 7.5 |
| 277.0 | 7.5 |
| 278.0 | 7.5 |
| 278.0 | 7.5 |
| 278.0 | 7.5 |
| 278.0 | 7.5 |
| 278.0 | 7.5 |
| 278.0 | 7.5 |
| 278.0 | 7.5 |
| 278.0 | 7.5 |
| 278.0 | 7.5 |
| 278.0 | 7.5 |
| 279.0 | 7.5 |
| 279.0 | 7.5 |
| 279.0 | 7.5 |
| 279.0 | 7.5 |
| 279.0 | 7.5 |
| 279.0 | 7.5 |
| 279.0 | 7.5 |
| 279.0 | 7.5 |
| 279.0 | 7.5 |
| 279.0 | 7.5 |
| 280.0 | 7.5 |
| 280.0 | 7.5 |
| 280.0 | 7.5 |
| 280.0 | 7.5 |
| 280.0 | 7.5 |
| 280.0 | 7.5 |
| 280.0 | 7.5 |
| 280.0 | 7.5 |
| 280.0 | 7.5 |
| 280.0 | 7.5 |
| 281.0 | 7.5 |
| 281.0 | 7.5 |
| 281.0 | 7.5 |
| 281.0 | 7.5 |
| 281.0 | 7.5 |
| 281.0 | 7.5 |
| 281.0 | 7.5 |
| 281.0 | 7.5 |
| 281.0 | 7.5 |
| 281.0 | 7.5 |
| 282.0 | 7.5 |
| 282.0 | 7.5 |
| 282.0 | 7.5 |
| 282.0 | 7.5 |
| 282.0 | 7.5 |
| 282.0 | 7.5 |
| 282.0 | 7.5 |
| 282.0 | 7.5 |
| 282.0 | 7.5 |
| 282.0 | 7.5 |
| 283.0 | 7.5 |
| 283.0 | 7.5 |
| 283.0 | 7.5 |
| 283.0 | 7.5 |
| 283.0 | 7.5 |
| 283.0 | 7.5 |
| 283.0 | 7.5 |
| 283.0 | 7.5 |
| 283.0 | 7.5 |
| 283.0 | 7.5 |
| 284.0 | 7.5 |
| 284.0 | 7.5 |
| 284.0 | 7.5 |
| 284.0 | 7.5 |
| 284.0 | 7.5 |
| 284.0 | 7.5 |
| 284.0 | 7.5 |
| 284.0 | 7.5 |
| 284.0 | 7.5 |
| 284.0 | 7.5 |
| 285.0 | 7.5 |
| 285.0 | 7.5 |
| 285.0 | 7.5 |
| 285.0 | 7.5 |
| 285.0 | 7.5 |
| 285.0 | 7.5 |
| 285.0 | 7.5 |
| 285.0 | 7.5 |
| 285.0 | 7.5 |
| 285.0 | 7.5 |
| 286.0 | 7.5 |
| 286.0 | 7.5 |
| 286.0 | 7.5 |
| 286.0 | 7.5 |
| 286.0 | 7.5 |
| 286.0 | 7.5 |
| 286.0 | 7.5 |
| 286.0 | 7.5 |
| 286.0 | 7.5 |
| 286.0 | 7.5 |
| 287.0 | 7.5 |
| 287.0 | 7.5 |
| 287.0 | 7.5 |
| 287.0 | 7.5 |
| 287.0 | 7.5 |
| 287.0 | 7.5 |
| 287.0 | 7.5 |
| 287.0 | 7.5 |
| 287.0 | 7.5 |
| 287.0 | 7.5 |
| 288.0 | 7.5 |
| 288.0 | 7.5 |
| 288.0 | 7.5 |
| 288.0 | 7.5 |
| 288.0 | 7.5 |
| 288.0 | 7.5 |
| 288.0 | 7.5 |
| 288.0 | 7.5 |
| 288.0 | 7.5 |
| 288.0 | 7.5 |
| 289.0 | 7.5 |
| 289.0 | 7.5 |
| 289.0 | 7.5 |
| 289.0 | 7.5 |
| 289.0 | 7.5 |
| 289.0 | 7.5 |
| 289.0 | 7.5 |
| 289.0 | 7.5 |
| 289.0 | 7.5 |
| 289.0 | 7.5 |
| 290.0 | 7.5 |
| 290.0 | 7.5 |
| 290.0 | 7.5 |
| 290.0 | 7.5 |
| 290.0 | 7.5 |
| 290.0 | 7.5 |
| 290.0 | 7.5 |
| 290.0 | 7.5 |
| 290.0 | 7.5 |
| 290.0 | 7.5 |
| 291.0 | 7.5 |
| 291.0 | 7.5 |
| 291.0 | 7.5 |
| 291.0 | 7.5 |
| 291.0 | 7.5 |
| 291.0 | 7.5 |
| 291.0 | 7.5 |
| 291.0 | 7.5 |
| 291.0 | 7.5 |
| 291.0 | 7.5 |
| 292.0 | 7.5 |
| 292.0 | 7.5 |
| 292.0 | 7.5 |
| 292.0 | 7.5 |
| 292.0 | 7.5 |
| 292.0 | 7.5 |
| 292.0 | 7.5 |
| 292.0 | 7.5 |
| 292.0 | 7.5 |
| 292.0 | 7.5 |
| 293.0 | 7.5 |
| 293.0 | 7.5 |
| 293.0 | 7.5 |
| 293.0 | 7.5 |
| 293.0 | 7.5 |
| 293.0 | 7.5 |
| 293.0 | 7.5 |
| 293.0 | 7.5 |
| 293.0 | 7.5 |
| 293.0 | 7.5 |
| 294.0 | 7.5 |
| 294.0 | 7.5 |
| 294.0 | 7.5 |
| 294.0 | 7.5 |
| 294.0 | 7.5 |
| 294.0 | 7.5 |
| 294.0 | 7.5 |
| 294.0 | 7.5 |
| 294.0 | 7.5 |
| 294.0 | 7.5 |
| 295.0 | 7.5 |
| 295.0 | 7.5 |
| 295.0 | 7.5 |
| 295.0 | 7.5 |
| 295.0 | 7.5 |
| 295.0 | 7.5 |
| 295.0 | 7.5 |
| 295.0 | 7.5 |
| 295.0 | 7.5 |
| 295.0 | 7.5 |
| 296.0 | 7.5 |
| 296.0 | 7.5 |
| 296.0 | 7.5 |
| 296.0 | 7.5 |
| 296.0 | 7.5 |
| 296.0 | 7.5 |
| 296.0 | 7.5 |
| 296.0 | 7.5 |
| 296.0 | 7.5 |
| 296.0 | 7.5 |
| 297.0 | 7.5 |
| 297.0 | 7.5 |
| 297.0 | 7.5 |
| 297.0 | 7.5 |
| 297.0 | 7.5 |
| 297.0 | 7.5 |
| 297.0 | 7.5 |
| 297.0 | 7.5 |
| 297.0 | 7.5 |
| 297.0 | 7.5 |
| 298.0 | 7.5 |
| 298.0 | 7.5 |
| 298.0 | 7.5 |
| 298.0 | 7.5 |
| 298.0 | 7.5 |
| 298.0 | 7.5 |
| 298.0 | 7.5 |
| 298.0 | 7.5 |
| 298.0 | 7.5 |
| 298.0 | 7.5 |
| 299.0 | 7.5 |
| 299.0 | 7.5 |
| 299.0 | 7.5 |
| 299.0 | 7.5 |
| 299.0 | 7.5 |
| 299.0 | 7.5 |
| 299.0 | 7.5 |
| 299.0 | 7.5 |
| 299.0 | 7.5 |
| 299.0 | 7.5 |
| 300.0 | 7.5 |
| 300.0 | 7.5 |
| 300.0 | 7.5 |
| 300.0 | 7.5 |
| 300.0 | 7.5 |